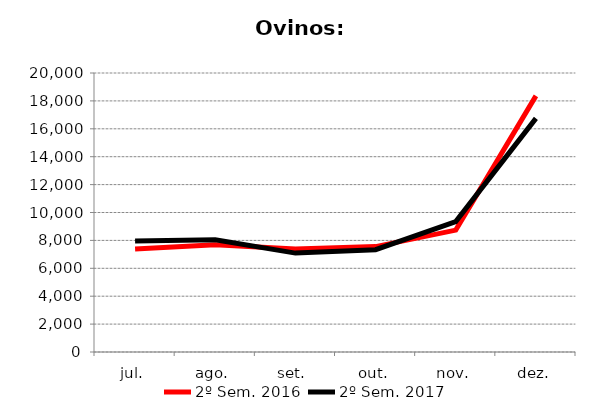
| Category | 2º Sem. 2016 | 2º Sem. 2017 |
|---|---|---|
| jul. | 7378 | 7949 |
| ago. | 7679 | 8039 |
| set. | 7386 | 7090 |
| out. | 7555 | 7337 |
| nov. | 8740 | 9348 |
| dez. | 18362 | 16749 |